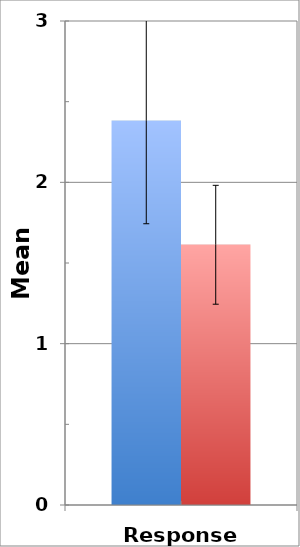
| Category | Low Unusual Experiences score | High Unusual Experiences score |
|---|---|---|
| Response criterion | 2.381 | 1.613 |